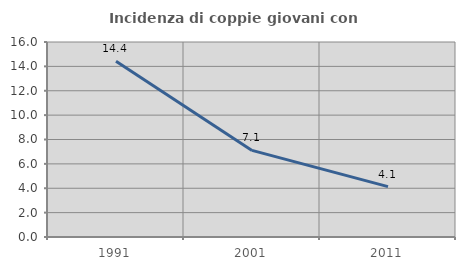
| Category | Incidenza di coppie giovani con figli |
|---|---|
| 1991.0 | 14.425 |
| 2001.0 | 7.105 |
| 2011.0 | 4.13 |